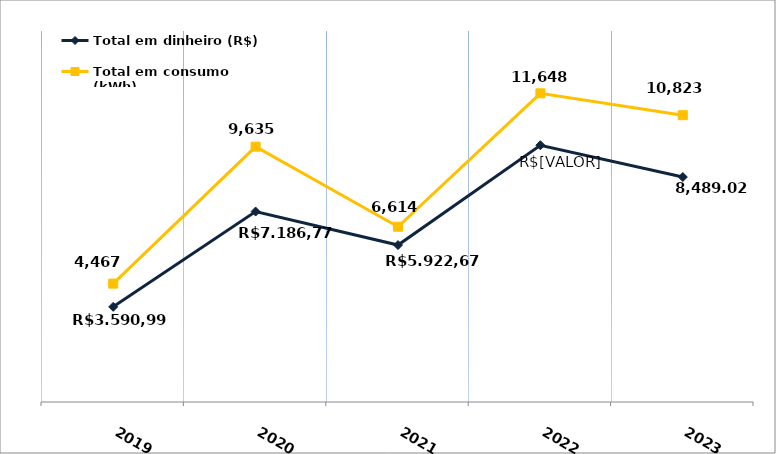
| Category | Total em dinheiro (R$) |
|---|---|
| 2019.0 | 3590.99 |
| 2020.0 | 7186.77 |
| 2021.0 | 5922.67 |
| 2022.0 | 9688.99 |
| 2023.0 | 8489.02 |